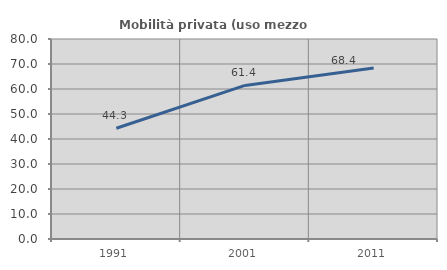
| Category | Mobilità privata (uso mezzo privato) |
|---|---|
| 1991.0 | 44.283 |
| 2001.0 | 61.431 |
| 2011.0 | 68.4 |